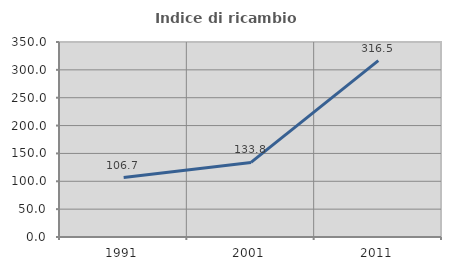
| Category | Indice di ricambio occupazionale  |
|---|---|
| 1991.0 | 106.65 |
| 2001.0 | 133.835 |
| 2011.0 | 316.547 |